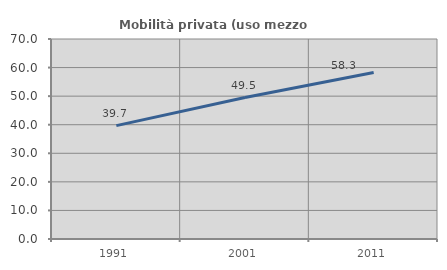
| Category | Mobilità privata (uso mezzo privato) |
|---|---|
| 1991.0 | 39.674 |
| 2001.0 | 49.5 |
| 2011.0 | 58.298 |